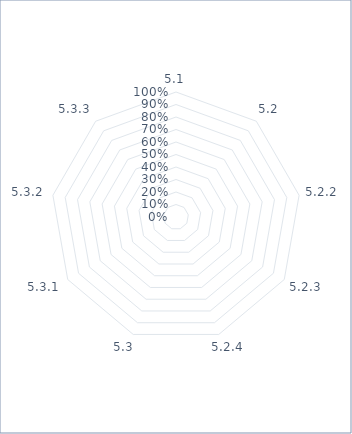
| Category | Series 0 |
|---|---|
| 5.1 | 0 |
| 5.2 | 0 |
| 5.2.2 | 0 |
| 5.2.3 | 0 |
| 5.2.4 | 0 |
| 5.3 | 0 |
| 5.3.1 | 0 |
| 5.3.2 | 0 |
| 5.3.3 | 0 |